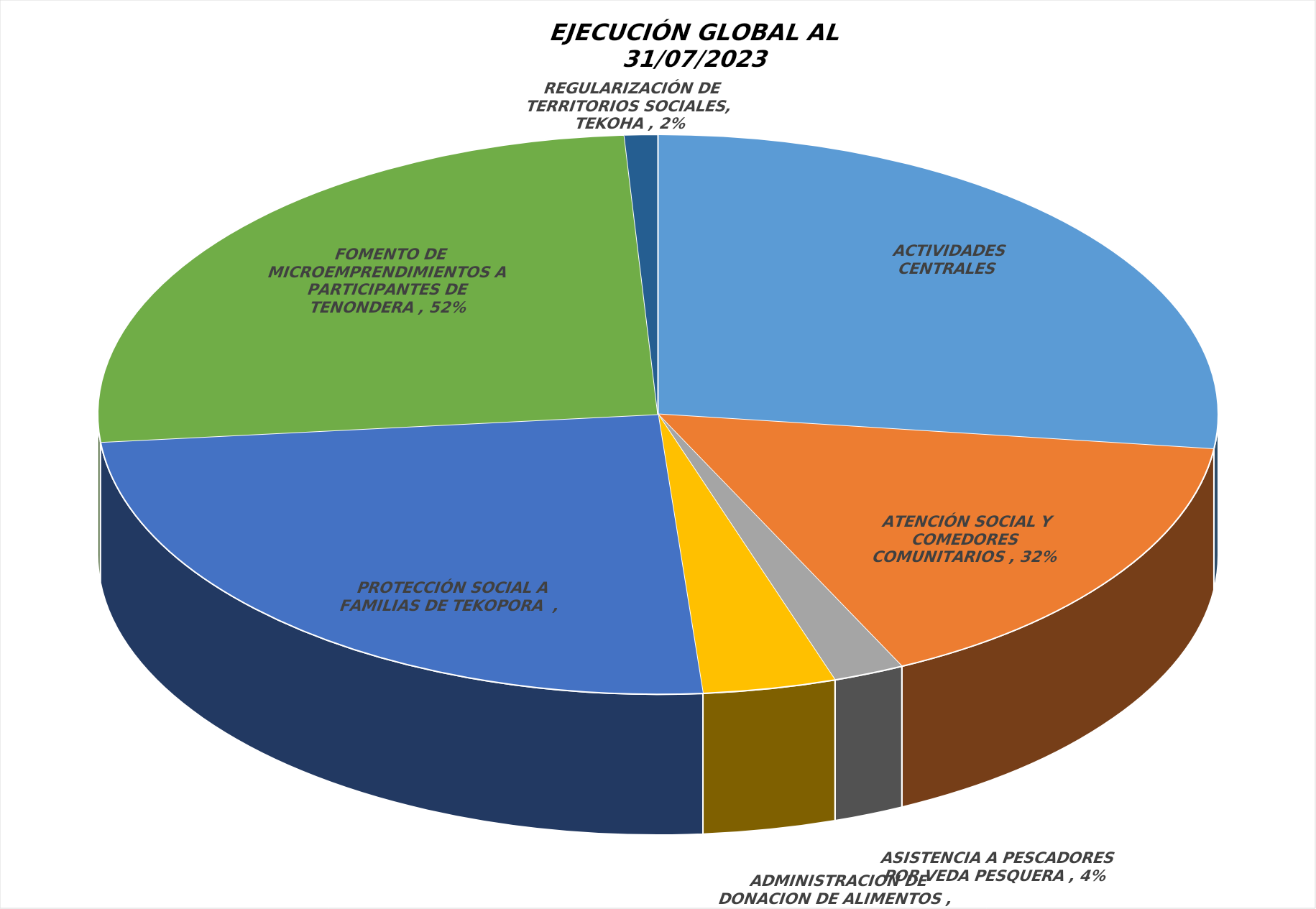
| Category | Series 0 |
|---|---|
| ACTIVIDADES CENTRALES ADMINISTRATIVAS | 0.55 |
| ATENCIÓN SOCIAL Y COMEDORES COMUNITARIOS | 0.323 |
| ASISTENCIA A PESCADORES POR VEDA PESQUERA | 0.042 |
| ADMINISTRACION DE DONACION DE ALIMENTOS | 0.078 |
| PROTECCIÓN SOCIAL A FAMILIAS DE TEKOPORA  | 0.503 |
| FOMENTO DE MICROEMPRENDIMIENTOS A PARTICIPANTES DE TENONDERA | 0.522 |
| REGULARIZACIÓN DE TERRITORIOS SOCIALES, TEKOHA | 0.02 |